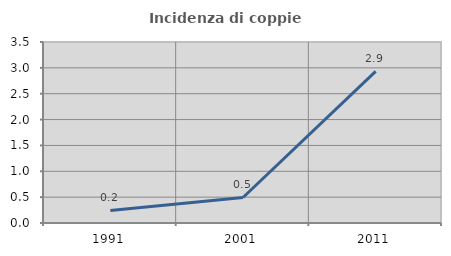
| Category | Incidenza di coppie miste |
|---|---|
| 1991.0 | 0.243 |
| 2001.0 | 0.494 |
| 2011.0 | 2.933 |